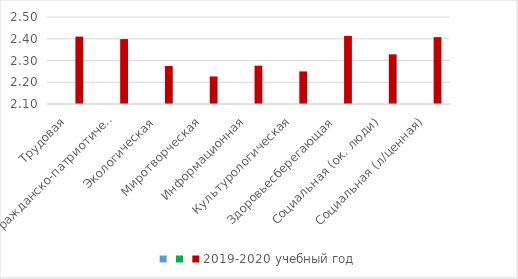
| Category | Series 0 | Series 1 | 2019-2020 учебный год |
|---|---|---|---|
| Трудовая |  |  | 2.41 |
| Гражданско-патриотическая |  |  | 2.398 |
| Экологическая |  |  | 2.275 |
| Миротворческая |  |  | 2.227 |
| Информационная |  |  | 2.276 |
| Культурологическая |  |  | 2.25 |
| Здоровьесберегающая |  |  | 2.413 |
| Социальная (ок. люди) |  |  | 2.328 |
| Социальная (л/ценная) |  |  | 2.407 |